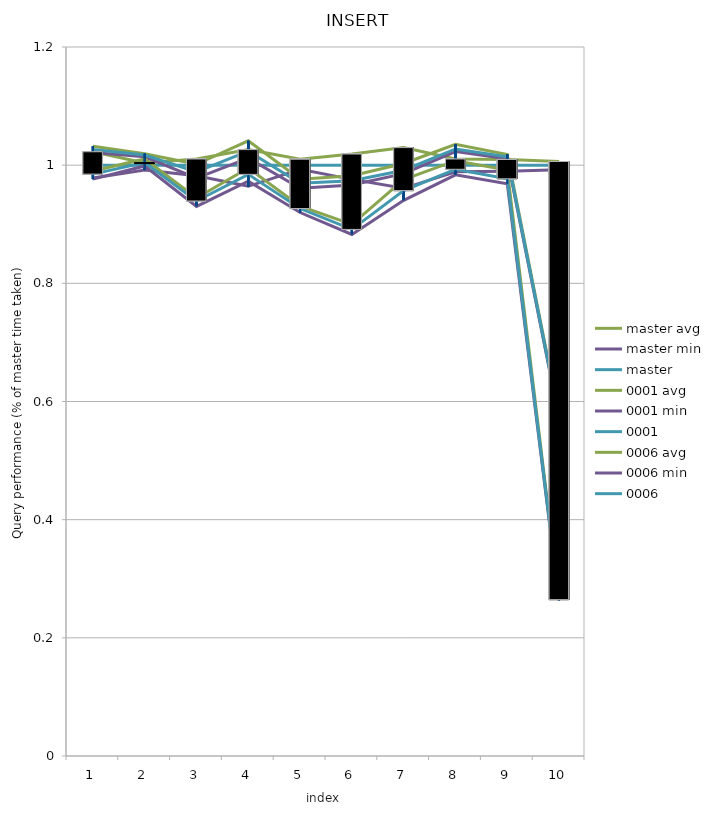
| Category | avg | master min | master | 0001 min | 0001 | 0006 min | 0006 |
|---|---|---|---|---|---|---|---|
| 0 | 0.99 | 0.978 | 1 | 1.021 | 1.027 | 0.976 | 0.985 |
| 1 | 1.011 | 0.992 | 1 | 1.014 | 1.017 | 0.999 | 1.004 |
| 2 | 0.944 | 0.982 | 1 | 0.978 | 0.989 | 0.93 | 0.939 |
| 3 | 0.995 | 0.964 | 1 | 1.012 | 1.024 | 0.973 | 0.984 |
| 4 | 0.93 | 0.993 | 1 | 0.961 | 0.969 | 0.92 | 0.927 |
| 5 | 0.9 | 0.976 | 1 | 0.966 | 0.974 | 0.883 | 0.891 |
| 6 | 0.975 | 0.961 | 1 | 0.986 | 0.991 | 0.94 | 0.957 |
| 7 | 1.008 | 0.989 | 1 | 1.023 | 1.027 | 0.984 | 0.993 |
| 8 | 0.992 | 0.99 | 1 | 1.011 | 1.014 | 0.968 | 0.977 |
| 9 | 0.266 | 0.992 | 1 | 0.572 | 0.574 | 0.264 | 0.265 |